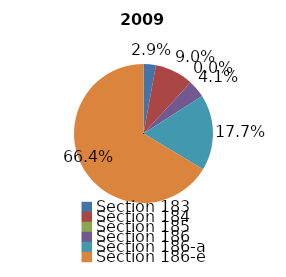
| Category | Series 0 |
|---|---|
| Section 183 | 19286968 |
| Section 184 | 60082900 |
| Section 185 | 24505 |
| Section 186 | 27551541 |
| Section 186-a | 118410258 |
| Section 186-e | 444713657 |